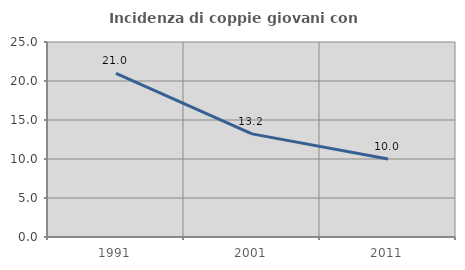
| Category | Incidenza di coppie giovani con figli |
|---|---|
| 1991.0 | 20.978 |
| 2001.0 | 13.222 |
| 2011.0 | 10 |